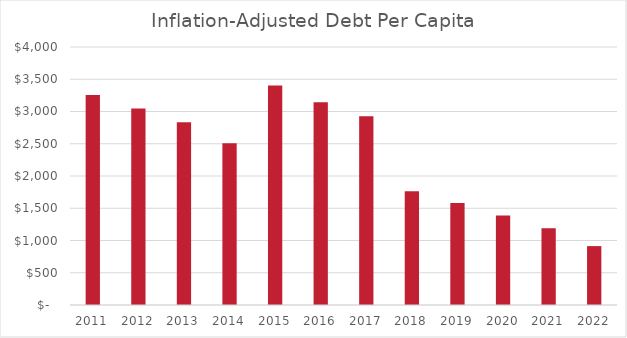
| Category | Inflation-Adjusted Debt Per Capita |
|---|---|
| 2011.0 | 3255.793 |
| 2012.0 | 3045.994 |
| 2013.0 | 2832.065 |
| 2014.0 | 2509.511 |
| 2015.0 | 3402.652 |
| 2016.0 | 3141.811 |
| 2017.0 | 2925 |
| 2018.0 | 1765 |
| 2019.0 | 1582 |
| 2020.0 | 1387 |
| 2021.0 | 1188 |
| 2022.0 | 913 |